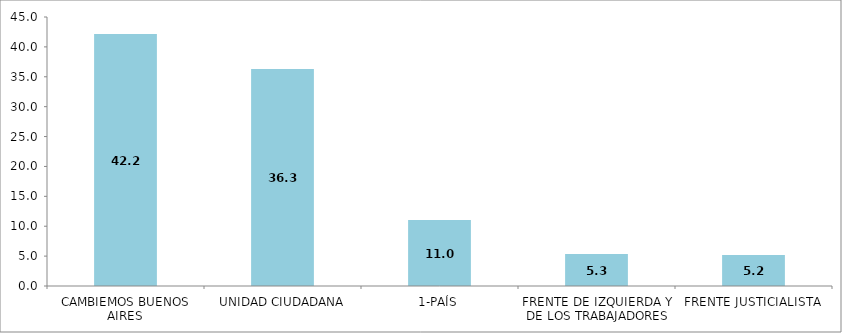
| Category | Listas |
|---|---|
| CAMBIEMOS BUENOS AIRES | 42.15 |
| UNIDAD CIUDADANA | 36.281 |
| 1-PAÍS | 11.029 |
| FRENTE DE IZQUIERDA Y DE LOS TRABAJADORES | 5.337 |
| FRENTE JUSTICIALISTA | 5.203 |